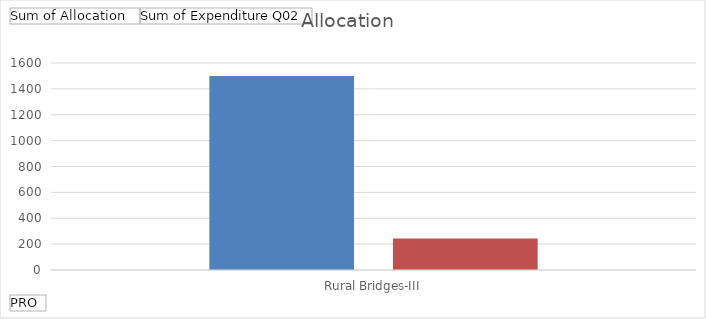
| Category | Sum of Allocation  | Sum of Expenditure Q02 |
|---|---|---|
| Rural Bridges-III | 1500 | 242.86 |